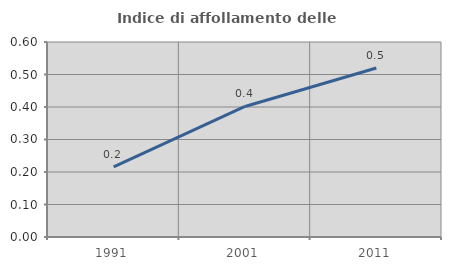
| Category | Indice di affollamento delle abitazioni  |
|---|---|
| 1991.0 | 0.216 |
| 2001.0 | 0.402 |
| 2011.0 | 0.52 |